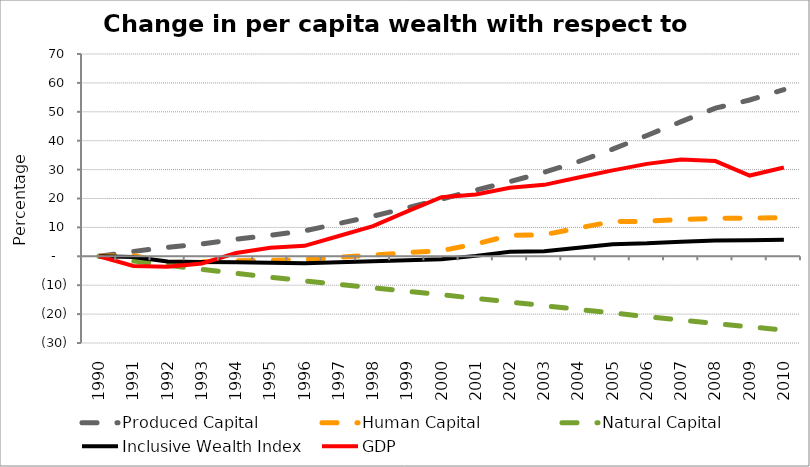
| Category | Produced Capital  | Human Capital | Natural Capital | Inclusive Wealth Index | GDP |
|---|---|---|---|---|---|
| 1990.0 | 0 | 0 | 0 | 0 | 0 |
| 1991.0 | 1.689 | 0.245 | -1.591 | -0.21 | -3.317 |
| 1992.0 | 3.093 | -2.191 | -3.098 | -1.761 | -3.62 |
| 1993.0 | 4.288 | -1.932 | -4.533 | -1.978 | -2.46 |
| 1994.0 | 5.889 | -1.575 | -5.905 | -2.065 | 1.153 |
| 1995.0 | 7.25 | -1.361 | -7.229 | -2.241 | 2.954 |
| 1996.0 | 8.821 | -1.148 | -8.492 | -2.366 | 3.63 |
| 1997.0 | 11.337 | -0.326 | -9.708 | -2.036 | 7.039 |
| 1998.0 | 13.874 | 0.39 | -10.898 | -1.746 | 10.449 |
| 1999.0 | 16.774 | 1.239 | -12.085 | -1.336 | 15.524 |
| 2000.0 | 19.807 | 1.96 | -13.3 | -0.981 | 20.446 |
| 2001.0 | 22.9 | 4.237 | -14.544 | 0.144 | 21.407 |
| 2002.0 | 25.846 | 7.251 | -15.809 | 1.606 | 23.701 |
| 2003.0 | 29.073 | 7.47 | -17.085 | 1.717 | 24.725 |
| 2004.0 | 32.751 | 9.806 | -18.359 | 2.944 | 27.268 |
| 2005.0 | 37.069 | 11.999 | -19.617 | 4.198 | 29.73 |
| 2006.0 | 41.816 | 12.111 | -20.86 | 4.486 | 31.983 |
| 2007.0 | 46.604 | 12.739 | -22.081 | 5.044 | 33.458 |
| 2008.0 | 51.278 | 13.129 | -23.267 | 5.481 | 32.964 |
| 2009.0 | 54.079 | 13.236 | -24.408 | 5.524 | 27.947 |
| 2010.0 | 57.709 | 13.349 | -25.516 | 5.7 | 30.736 |